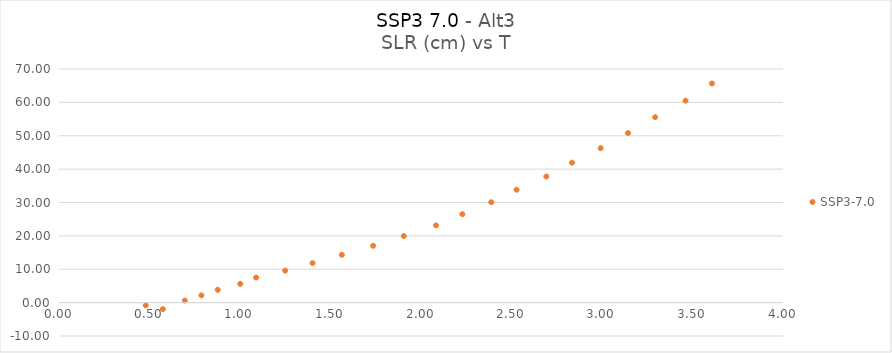
| Category | SSP3-7.0 |
|---|---|
| 0.573801925 | -1.941 |
| 0.479031654 | -0.818 |
| 0.695197934 | 0.621 |
| 0.786748548 | 2.18 |
| 0.877021499 | 3.834 |
| 1.001520332 | 5.633 |
| 1.089128948 | 7.505 |
| 1.249789297 | 9.582 |
| 1.40069434 | 11.846 |
| 1.562661509 | 14.32 |
| 1.735473954 | 17.026 |
| 1.904846317 | 19.961 |
| 2.083138289 | 23.144 |
| 2.228576862 | 26.508 |
| 2.38808986 | 30.084 |
| 2.527926317 | 33.829 |
| 2.692364426 | 37.795 |
| 2.834289275 | 41.936 |
| 2.992626526 | 46.285 |
| 3.14387675 | 50.827 |
| 3.293611787 | 55.56 |
| 3.46151266 | 60.522 |
| 3.607415207 | 65.667 |